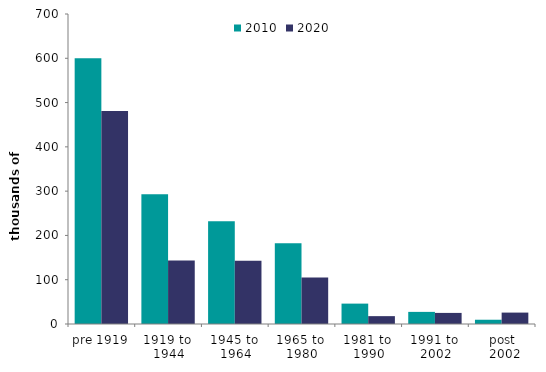
| Category | 2010 | 2020 |
|---|---|---|
| pre 1919 | 600.152 | 481.163 |
| 1919 to 
1944 | 293.078 | 143.664 |
| 1945 to 
1964 | 232.115 | 143.011 |
| 1965 to 
1980 | 182.428 | 105.046 |
| 1981 to 
1990 | 46.033 | 17.75 |
| 1991 to 
2002 | 27.356 | 25.041 |
| post
 2002 | 9.622 | 25.767 |